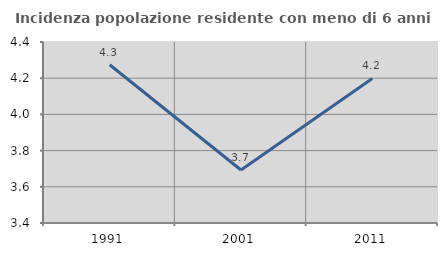
| Category | Incidenza popolazione residente con meno di 6 anni |
|---|---|
| 1991.0 | 4.274 |
| 2001.0 | 3.693 |
| 2011.0 | 4.198 |